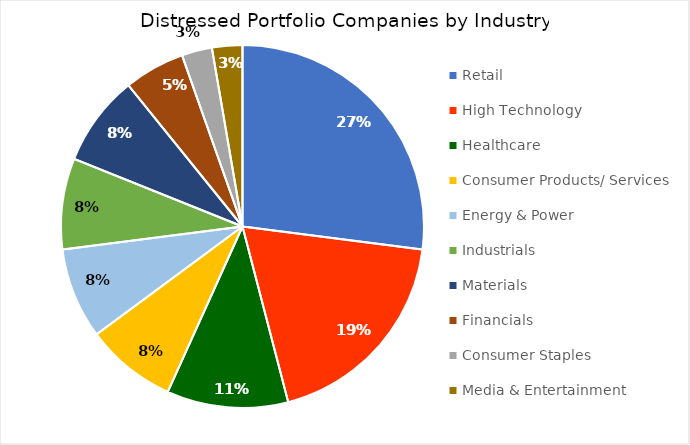
| Category | Series 0 |
|---|---|
| Retail | 10 |
| High Technology | 7 |
| Healthcare | 4 |
| Consumer Products/ Services | 3 |
| Energy & Power | 3 |
| Industrials | 3 |
| Materials | 3 |
| Financials | 2 |
| Consumer Staples | 1 |
| Media & Entertainment | 1 |